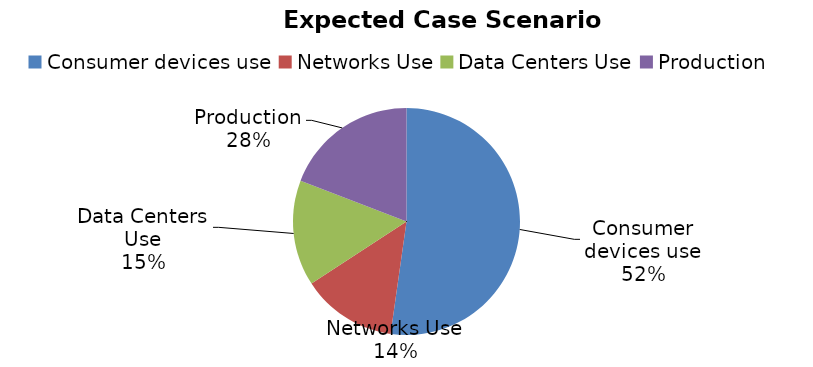
| Category | Series 0 |
|---|---|
| Consumer devices use | 1038.523 |
| Networks Use | 269.304 |
| Data Centers Use | 299.428 |
| Production | 380.726 |